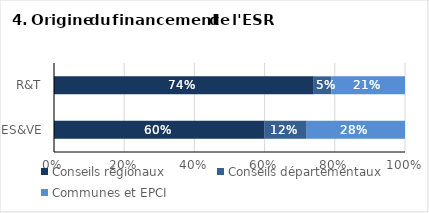
| Category | Conseils régionaux | Conseils départementaux | Communes et EPCI |
|---|---|---|---|
| ES&VE | 0.6 | 0.12 | 0.28 |
| R&T | 0.74 | 0.05 | 0.21 |